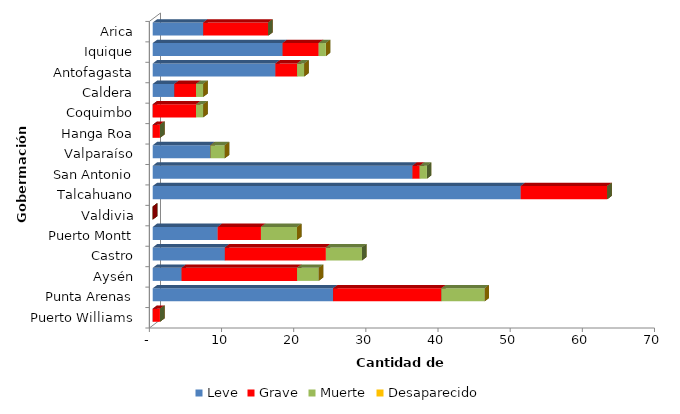
| Category | Leve | Grave | Muerte | Desaparecido |
|---|---|---|---|---|
| Arica | 7 | 9 | 0 | 0 |
| Iquique | 18 | 5 | 1 | 0 |
| Antofagasta | 17 | 3 | 1 | 0 |
| Caldera | 3 | 3 | 1 | 0 |
| Coquimbo | 0 | 6 | 1 | 0 |
| Hanga Roa | 0 | 1 | 0 | 0 |
| Valparaíso | 8 | 0 | 2 | 0 |
| San Antonio | 36 | 1 | 1 | 0 |
| Talcahuano | 51 | 12 | 0 | 0 |
| Valdivia | 0 | 0 | 0 | 0 |
| Puerto Montt | 9 | 6 | 5 | 0 |
| Castro | 10 | 14 | 5 | 0 |
| Aysén | 4 | 16 | 3 | 0 |
| Punta Arenas | 25 | 15 | 6 | 0 |
| Puerto Williams | 0 | 1 | 0 | 0 |